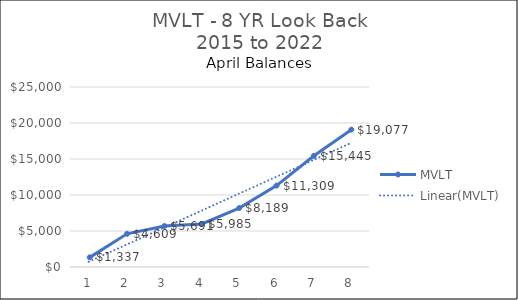
| Category | MVLT |
|---|---|
| 0 | 1337.11 |
| 1 | 4608.79 |
| 2 | 5691 |
| 3 | 5985.35 |
| 4 | 8188.68 |
| 5 | 11309.48 |
| 6 | 15445.25 |
| 7 | 19076.79 |